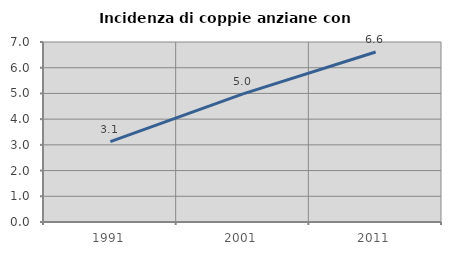
| Category | Incidenza di coppie anziane con figli |
|---|---|
| 1991.0 | 3.126 |
| 2001.0 | 4.982 |
| 2011.0 | 6.613 |